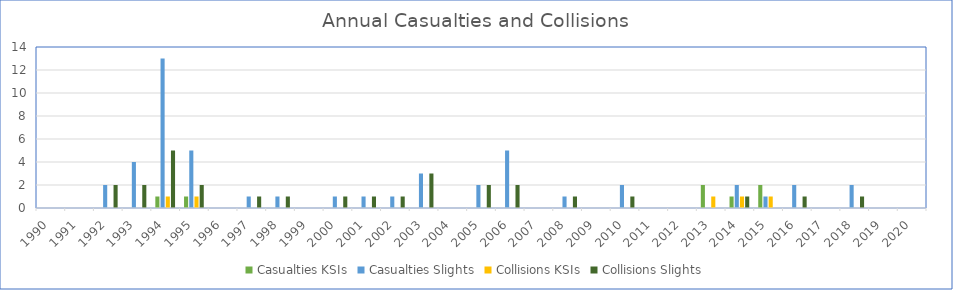
| Category | Casualties | Collisions |
|---|---|---|
| 1990.0 | 0 | 0 |
| 1991.0 | 0 | 0 |
| 1992.0 | 2 | 2 |
| 1993.0 | 4 | 2 |
| 1994.0 | 13 | 5 |
| 1995.0 | 5 | 2 |
| 1996.0 | 0 | 0 |
| 1997.0 | 1 | 1 |
| 1998.0 | 1 | 1 |
| 1999.0 | 0 | 0 |
| 2000.0 | 1 | 1 |
| 2001.0 | 1 | 1 |
| 2002.0 | 1 | 1 |
| 2003.0 | 3 | 3 |
| 2004.0 | 0 | 0 |
| 2005.0 | 2 | 2 |
| 2006.0 | 5 | 2 |
| 2007.0 | 0 | 0 |
| 2008.0 | 1 | 1 |
| 2009.0 | 0 | 0 |
| 2010.0 | 2 | 1 |
| 2011.0 | 0 | 0 |
| 2012.0 | 0 | 0 |
| 2013.0 | 0 | 0 |
| 2014.0 | 2 | 1 |
| 2015.0 | 1 | 0 |
| 2016.0 | 2 | 1 |
| 2017.0 | 0 | 0 |
| 2018.0 | 2 | 1 |
| 2019.0 | 0 | 0 |
| 2020.0 | 0 | 0 |